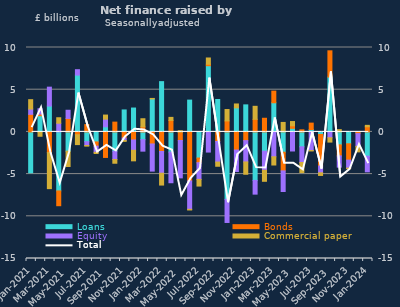
| Category | Loans | Bonds | Equity | Commercial paper |
|---|---|---|---|---|
| Jan-2021 | -4.845 | 2.081 | 0.626 | 1.11 |
| Feb-2021 | 1.92 | 0.193 | 0.629 | -0.517 |
| Mar-2021 | 3.061 | -2.452 | 2.24 | -4.272 |
| Apr-2021 | -6.992 | -1.754 | 1.028 | 0.65 |
| May-2021 | -2.286 | 1.596 | 0.969 | -1.817 |
| Jun-2021 | 6.732 | -0.338 | 0.639 | -1.166 |
| Jul-2021 | -1.159 | 0.867 | -0.455 | -0.072 |
| Aug-2021 | -1.188 | -0.499 | -0.734 | -0.136 |
| Sep-2021 | 0.609 | -3.026 | 0.905 | 0.481 |
| Oct-2021 | -2.286 | 1.158 | -0.982 | -0.446 |
| Nov-2021 | 2.602 | -0.729 | -0.285 | -0.107 |
| Dec-2021 | 2.828 | -0.957 | -1.221 | -1.25 |
| Jan-2022 | -0.922 | 0.598 | -1.358 | 0.961 |
| Feb-2022 | 3.908 | -1.431 | -3.213 | 0.058 |
| Mar-2022 | 5.955 | -2.323 | -2.573 | -1.403 |
| Apr-2022 | -2.393 | 1.362 | -3.63 | 0.359 |
| May-2022 | -0.079 | -0.942 | -4.427 | 0.142 |
| Jun-2022 | 3.766 | -5.816 | -3.354 | -0.081 |
| Jul-2022 | -3.097 | -0.555 | -1.975 | -0.789 |
| Aug-2022 | 7.843 | 0.173 | -2.39 | 0.742 |
| Sep-2022 | 3.839 | -1.135 | -2.441 | -0.495 |
| Oct-2022 | -7.996 | 1.304 | -2.735 | 1.347 |
| Nov-2022 | 2.849 | -2.15 | -2.54 | 0.46 |
| Dec-2022 | 3.202 | -1.032 | -2.53 | -1.457 |
| Jan-2023 | -5.748 | 1.488 | -1.625 | 1.544 |
| Feb-2023 | -2.291 | 1.616 | -2.256 | -1.306 |
| Mar-2023 | 3.453 | 1.375 | -2.949 | -0.973 |
| Apr-2023 | -2.409 | -2.212 | -2.44 | 1.122 |
| May-2023 | 0.425 | 0.298 | -2.261 | 0.503 |
| Jun-2023 | -1.766 | 0.244 | -1.856 | -1.198 |
| Jul-2023 | 0.287 | 0.754 | -2.207 | -0.052 |
| Aug-2023 | -0.304 | -3.733 | -0.81 | -0.312 |
| Sep-2023 | 6.498 | 3.109 | -0.695 | -0.512 |
| Oct-2023 | -1.536 | -1.306 | -1.334 | 0.267 |
| Nov-2023 | -1.408 | -1.935 | -0.948 | -0.066 |
| Dec-2023 | -0.048 | -0.156 | -1.511 | -0.653 |
| Jan-2024 | -2.879 | 0.609 | -1.852 | 0.167 |